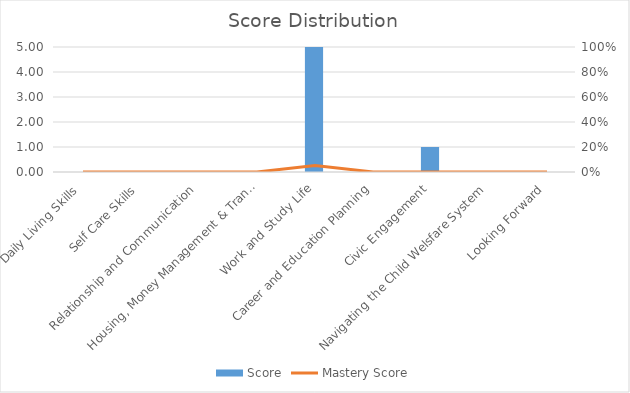
| Category | Score |
|---|---|
| Daily Living Skills | 0 |
| Self Care Skills | 0 |
| Relationship and Communication | 0 |
| Housing, Money Management & Transportation | 0 |
| Work and Study Life | 5 |
| Career and Education Planning | 0 |
| Civic Engagement | 1 |
| Navigating the Child Welsfare System | 0 |
| Looking Forward | 0 |